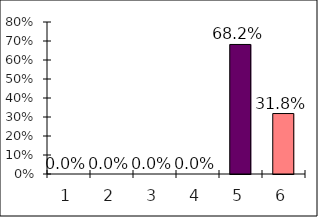
| Category | Series 0 |
|---|---|
| 0 | 0 |
| 1 | 0 |
| 2 | 0 |
| 3 | 0 |
| 4 | 0.682 |
| 5 | 0.318 |